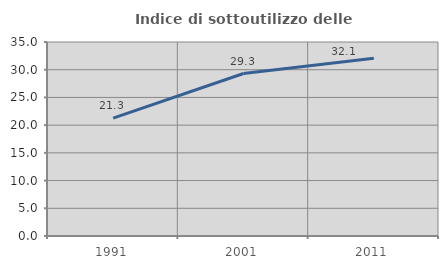
| Category | Indice di sottoutilizzo delle abitazioni  |
|---|---|
| 1991.0 | 21.255 |
| 2001.0 | 29.314 |
| 2011.0 | 32.071 |